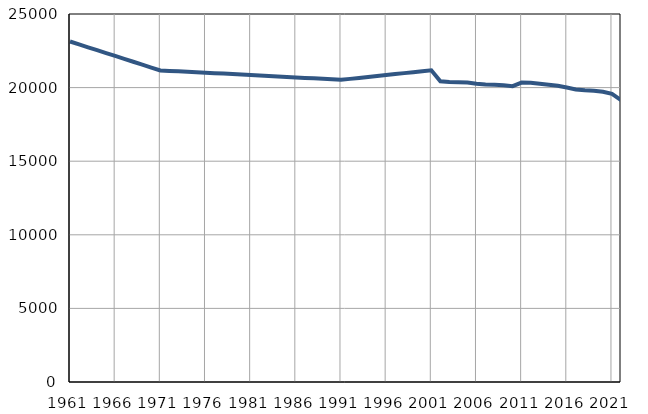
| Category | Population
size |
|---|---|
| 1961.0 | 23131 |
| 1962.0 | 22934 |
| 1963.0 | 22738 |
| 1964.0 | 22542 |
| 1965.0 | 22345 |
| 1966.0 | 22149 |
| 1967.0 | 21952 |
| 1968.0 | 21756 |
| 1969.0 | 21559 |
| 1970.0 | 21363 |
| 1971.0 | 21166 |
| 1972.0 | 21135 |
| 1973.0 | 21105 |
| 1974.0 | 21074 |
| 1975.0 | 21044 |
| 1976.0 | 21013 |
| 1977.0 | 20982 |
| 1978.0 | 20952 |
| 1979.0 | 20921 |
| 1980.0 | 20891 |
| 1981.0 | 20860 |
| 1982.0 | 20827 |
| 1983.0 | 20793 |
| 1984.0 | 20760 |
| 1985.0 | 20727 |
| 1986.0 | 20694 |
| 1987.0 | 20660 |
| 1988.0 | 20627 |
| 1989.0 | 20594 |
| 1990.0 | 20560 |
| 1991.0 | 20527 |
| 1992.0 | 20592 |
| 1993.0 | 20658 |
| 1994.0 | 20723 |
| 1995.0 | 20788 |
| 1996.0 | 20853 |
| 1997.0 | 20919 |
| 1998.0 | 20984 |
| 1999.0 | 21049 |
| 2000.0 | 21114 |
| 2001.0 | 21180 |
| 2002.0 | 20430 |
| 2003.0 | 20385 |
| 2004.0 | 20361 |
| 2005.0 | 20339 |
| 2006.0 | 20258 |
| 2007.0 | 20207 |
| 2008.0 | 20190 |
| 2009.0 | 20157 |
| 2010.0 | 20099 |
| 2011.0 | 20338 |
| 2012.0 | 20331 |
| 2013.0 | 20257 |
| 2014.0 | 20192 |
| 2015.0 | 20126 |
| 2016.0 | 20002 |
| 2017.0 | 19870 |
| 2018.0 | 19819 |
| 2019.0 | 19788 |
| 2020.0 | 19714 |
| 2021.0 | 19572 |
| 2022.0 | 19153 |